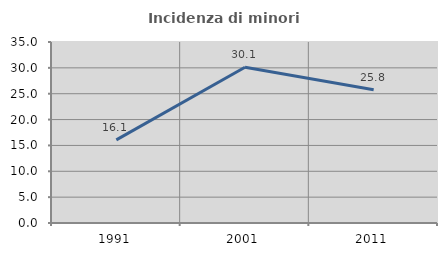
| Category | Incidenza di minori stranieri |
|---|---|
| 1991.0 | 16.071 |
| 2001.0 | 30.12 |
| 2011.0 | 25.762 |